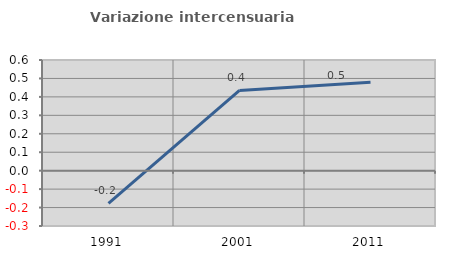
| Category | Variazione intercensuaria annua |
|---|---|
| 1991.0 | -0.177 |
| 2001.0 | 0.435 |
| 2011.0 | 0.48 |